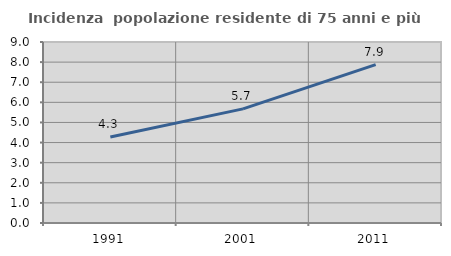
| Category | Incidenza  popolazione residente di 75 anni e più |
|---|---|
| 1991.0 | 4.277 |
| 2001.0 | 5.676 |
| 2011.0 | 7.874 |